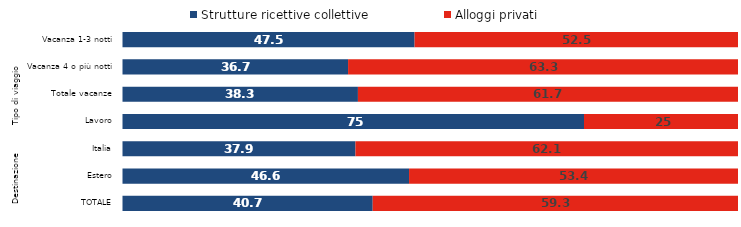
| Category | Strutture ricettive collettive | Alloggi privati |
|---|---|---|
| 0 | 47.5 | 52.5 |
| 1 | 36.7 | 63.3 |
| 2 | 38.3 | 61.7 |
| 3 | 75 | 25 |
| 4 | 37.9 | 62.1 |
| 5 | 46.6 | 53.4 |
| 6 | 40.7 | 59.3 |